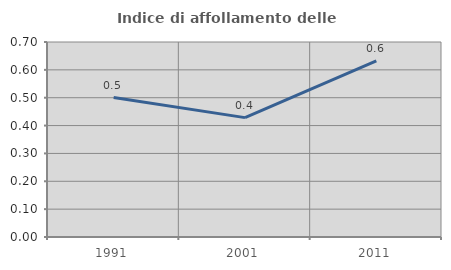
| Category | Indice di affollamento delle abitazioni  |
|---|---|
| 1991.0 | 0.501 |
| 2001.0 | 0.429 |
| 2011.0 | 0.632 |